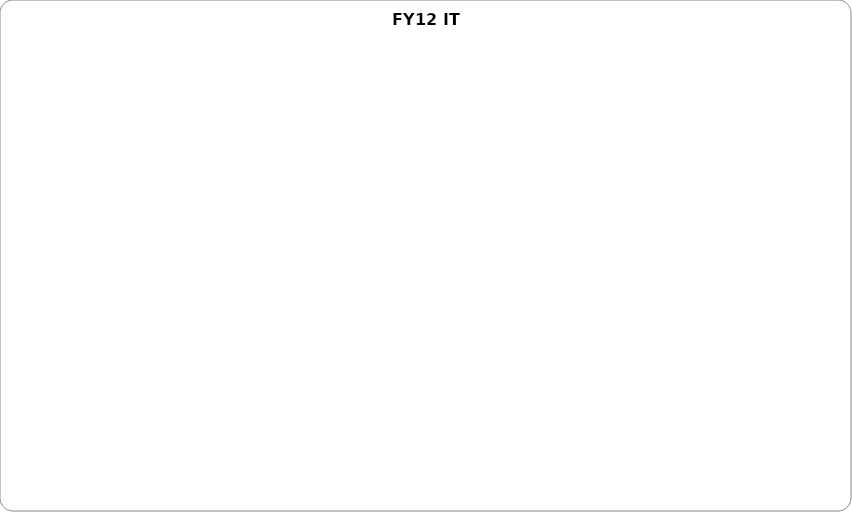
| Category | Series 0 |
|---|---|
| Personnel | 0 |
| M & S | 0 |
| Asset Replacement | 0 |
| Bond Fund | 0 |
| Projects | 0 |